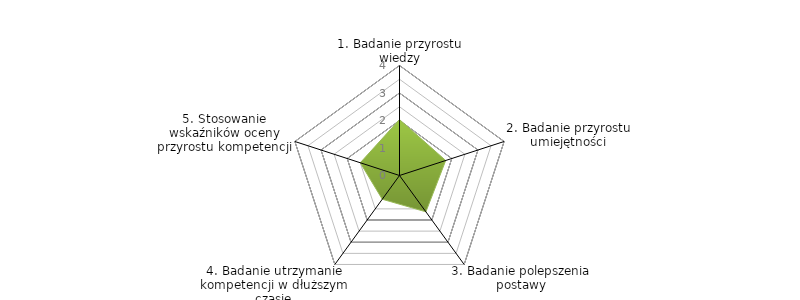
| Category | Series 0 | BENCHMARK |
|---|---|---|
| 1. Badanie przyrostu wiedzy |  | 2.033 |
| 2. Badanie przyrostu umiejętności |  | 1.767 |
| 3. Badanie polepszenia postawy |  | 1.633 |
| 4. Badanie utrzymanie kompetencji w dłuższym czasie |  | 1.067 |
| 5. Stosowanie wskaźników oceny przyrostu kompetencji |  | 1.5 |